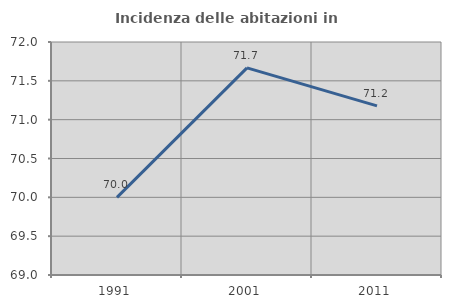
| Category | Incidenza delle abitazioni in proprietà  |
|---|---|
| 1991.0 | 70 |
| 2001.0 | 71.667 |
| 2011.0 | 71.178 |